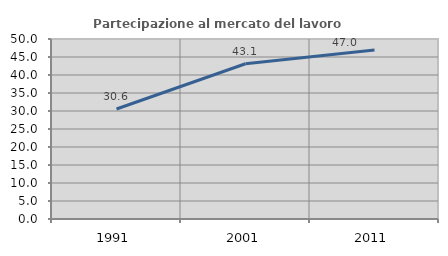
| Category | Partecipazione al mercato del lavoro  femminile |
|---|---|
| 1991.0 | 30.556 |
| 2001.0 | 43.121 |
| 2011.0 | 46.952 |